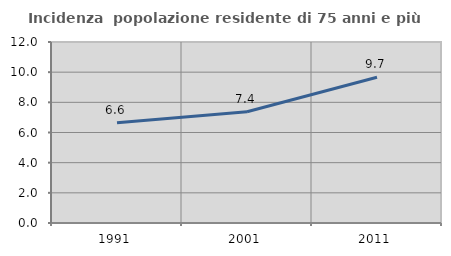
| Category | Incidenza  popolazione residente di 75 anni e più |
|---|---|
| 1991.0 | 6.641 |
| 2001.0 | 7.377 |
| 2011.0 | 9.662 |